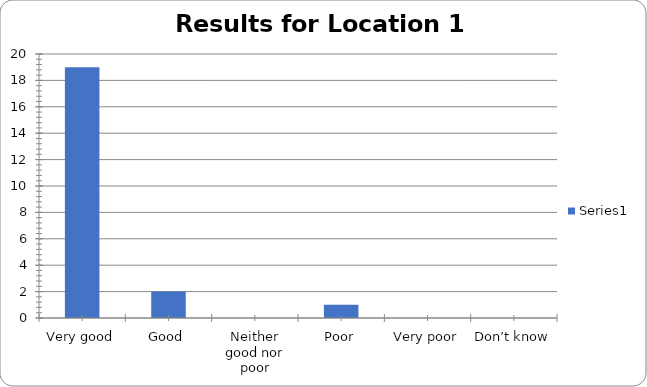
| Category | Series 0 |
|---|---|
| Very good | 19 |
| Good | 2 |
| Neither good nor poor | 0 |
| Poor | 1 |
| Very poor | 0 |
| Don’t know | 0 |